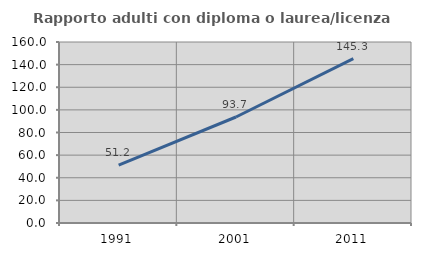
| Category | Rapporto adulti con diploma o laurea/licenza media  |
|---|---|
| 1991.0 | 51.242 |
| 2001.0 | 93.71 |
| 2011.0 | 145.339 |